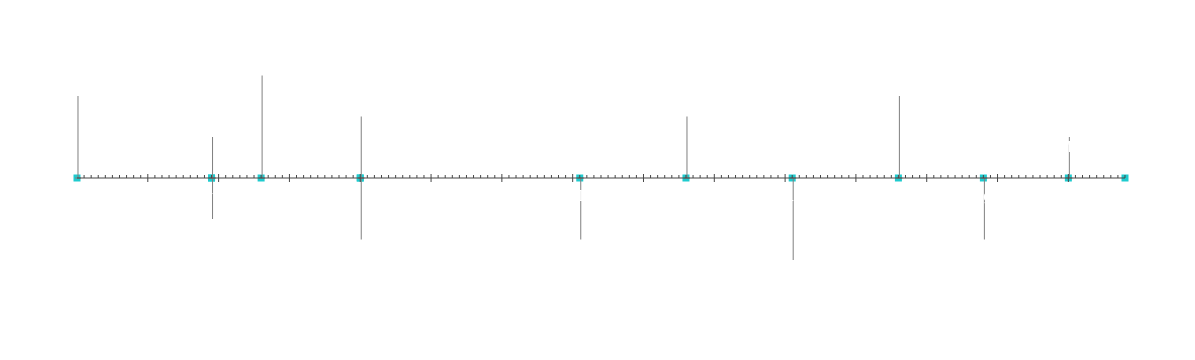
| Category | Pozíció |
|---|---|
| Projekt kezdete | 20 |
| 1. mérföldkő | 10 |
| 2. mérföldkő | -10 |
| 3. mérföldkő | 25 |
| 4. mérföldkő | -15 |
| 5. mérföldkő | 15 |
| 6. mérföldkő | -15 |
| 7. mérföldkő | 15 |
| 8. mérföldkő | -20 |
| 9. mérföldkő | 20 |
| 10. mérföldkő | -15 |
| 11. mérföldkő | 10 |
| Projekt vége | 5 |